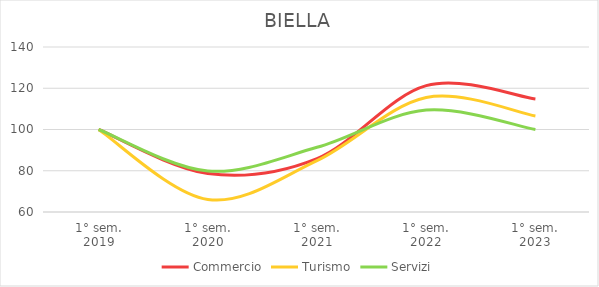
| Category | Commercio | Turismo | Servizi |
|---|---|---|---|
| 1° sem.
2019 | 100 | 100 | 100 |
| 1° sem.
2020 | 78.632 | 66.084 | 79.878 |
| 1° sem.
2021 | 85.897 | 84.934 | 91.363 |
| 1° sem.
2022 | 121.261 | 115.502 | 109.416 |
| 1° sem.
2023 | 114.744 | 106.55 | 99.951 |